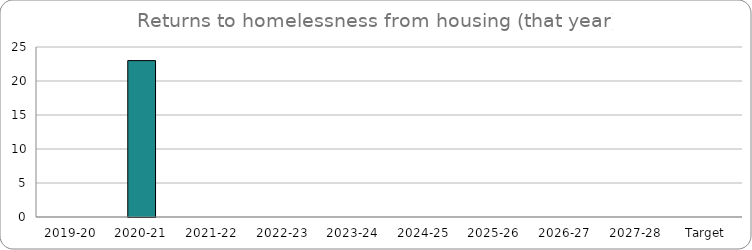
| Category | Series 0 |
|---|---|
| 2019-20 | 0 |
| 2020-21 | 23 |
| 2021-22 | 0 |
| 2022-23 | 0 |
| 2023-24 | 0 |
| 2024-25 | 0 |
| 2025-26 | 0 |
| 2026-27 | 0 |
| 2027-28 | 0 |
| Target | 0 |